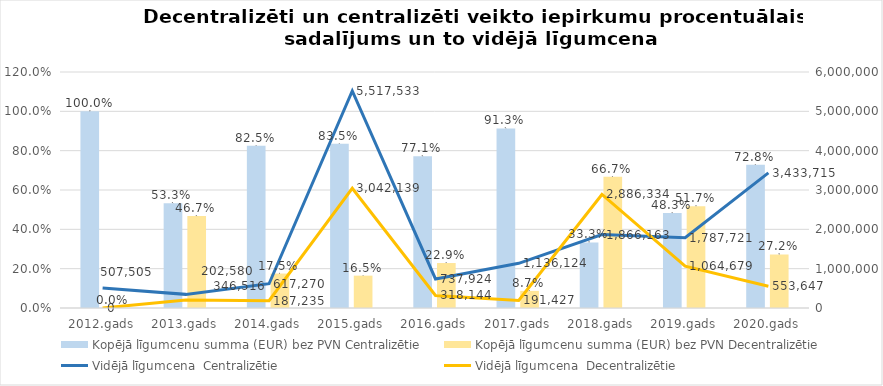
| Category | Kopējā līgumcenu summa (EUR) bez PVN |
|---|---|
| 2012.gads | 0 |
| 2013.gads | 0.467 |
| 2014.gads | 0.175 |
| 2015.gads | 0.165 |
| 2016.gads | 0.229 |
| 2017.gads | 0.087 |
| 2018.gads | 0.667 |
| 2019.gads | 0.517 |
| 2020.gads | 0.272 |